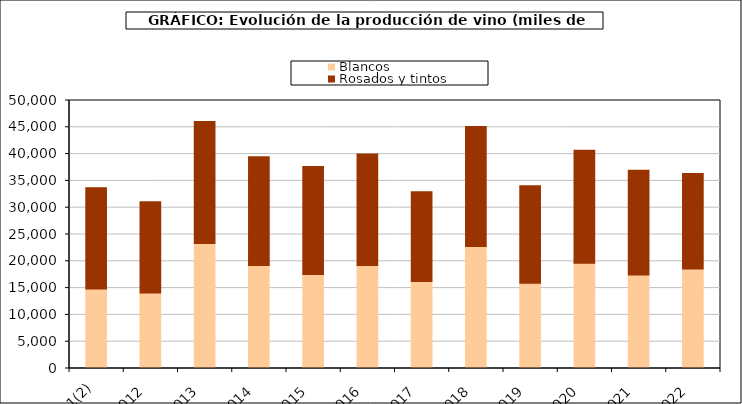
| Category | Blancos | Rosados y tintos |
|---|---|---|
| 2011(2) | 14820.108 | 18889.015 |
| 2012  | 14069.736 | 17052.824 |
| 2013  | 23343.372 | 22735.173 |
| 2014  | 19206.264 | 20287.417 |
| 2015  | 17539.622 | 20162.903 |
| 2016  | 19213.073 | 20826.807 |
| 2017  | 16231.668 | 16738.51 |
| 2018  | 22765.55 | 22400.122 |
| 2019  | 15912.993 | 18167.776 |
| 2020  | 19646.719 | 21081.27 |
| 2021  | 17423.321 | 19582.556 |
| 2022  | 18548.384 | 17853.594 |